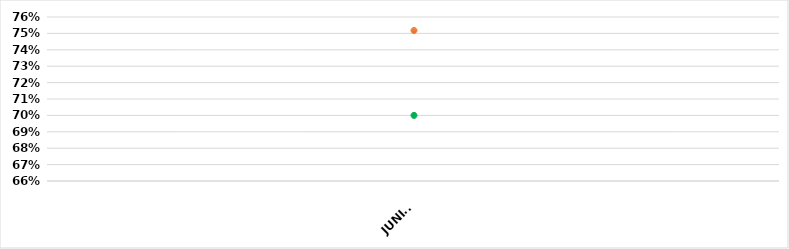
| Category | VALOR  | META PONDERADA |
|---|---|---|
| JUNIO | 0.752 | 0.7 |